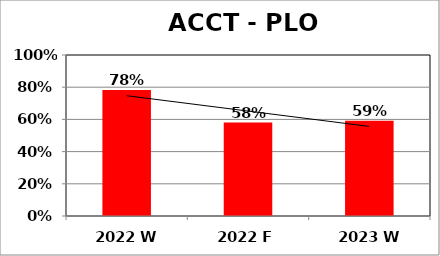
| Category | Series 0 |
|---|---|
| 2022 W | 0.783 |
| 2022 F | 0.58 |
| 2023 W | 0.592 |